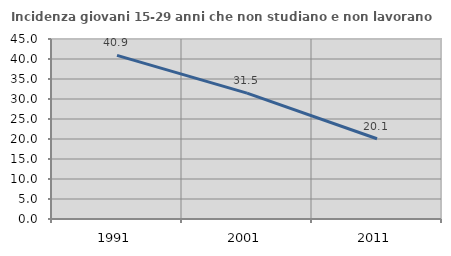
| Category | Incidenza giovani 15-29 anni che non studiano e non lavorano  |
|---|---|
| 1991.0 | 40.913 |
| 2001.0 | 31.467 |
| 2011.0 | 20.065 |